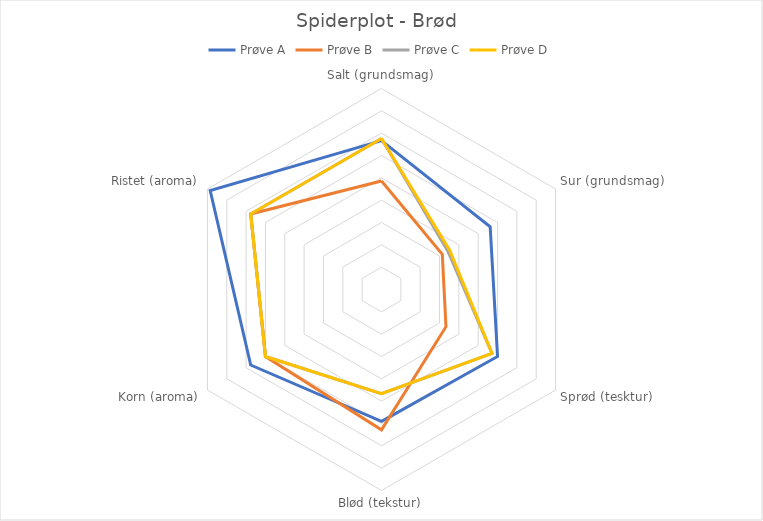
| Category | Prøve A | Prøve B | Prøve C | Prøve D |
|---|---|---|---|---|
| Salt (grundsmag) | 3.333 | 2.429 | 3.381 | 3.381 |
| Sur (grundsmag) | 2.81 | 1.571 | 1.714 | 1.762 |
| Sprød (tesktur) | 3 | 1.667 | 2.857 | 2.857 |
| Blød (tekstur) | 2.952 | 3.143 | 2.333 | 2.333 |
| Korn (aroma) | 3.381 | 3 | 3 | 3 |
| Ristet (aroma) | 4.429 | 3.381 | 3.381 | 3.381 |